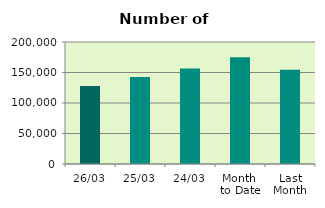
| Category | Series 0 |
|---|---|
| 26/03 | 127856 |
| 25/03 | 142652 |
| 24/03 | 156484 |
| Month 
to Date | 174899.9 |
| Last
Month | 154356.5 |